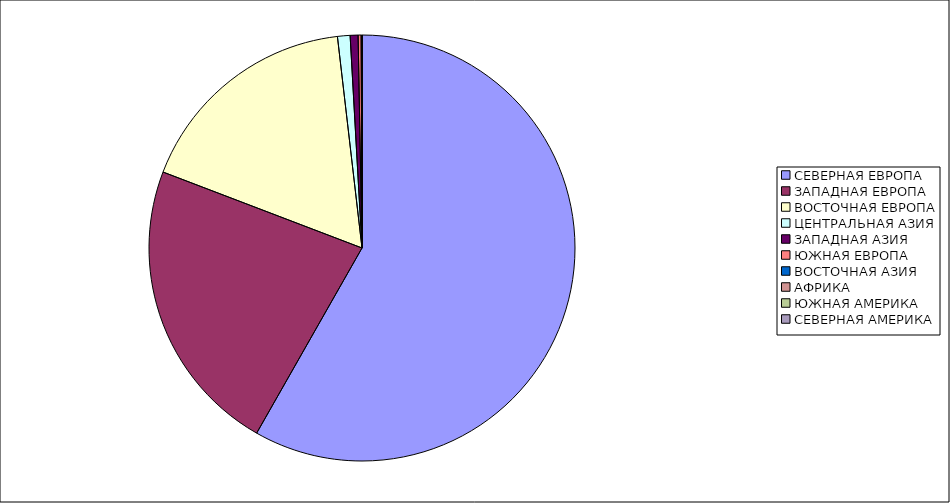
| Category | Оборот |
|---|---|
| СЕВЕРНАЯ ЕВРОПА | 58.234 |
| ЗАПАДНАЯ ЕВРОПА | 22.57 |
| ВОСТОЧНАЯ ЕВРОПА | 17.353 |
| ЦЕНТРАЛЬНАЯ АЗИЯ | 0.953 |
| ЗАПАДНАЯ АЗИЯ | 0.598 |
| ЮЖНАЯ ЕВРОПА | 0.227 |
| ВОСТОЧНАЯ АЗИЯ | 0.043 |
| АФРИКА | 0.014 |
| ЮЖНАЯ АМЕРИКА | 0.007 |
| СЕВЕРНАЯ АМЕРИКА | 0.001 |